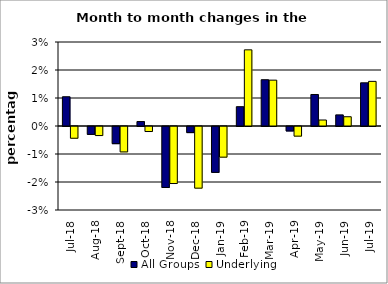
| Category | All Groups | Underlying |
|---|---|---|
| 2018-07-01 | 0.01 | -0.004 |
| 2018-08-01 | -0.003 | -0.003 |
| 2018-09-01 | -0.006 | -0.009 |
| 2018-10-01 | 0.002 | -0.002 |
| 2018-11-01 | -0.022 | -0.02 |
| 2018-12-01 | -0.002 | -0.022 |
| 2019-01-01 | -0.016 | -0.011 |
| 2019-02-01 | 0.007 | 0.027 |
| 2019-03-01 | 0.017 | 0.016 |
| 2019-04-01 | -0.002 | -0.003 |
| 2019-05-01 | 0.011 | 0.002 |
| 2019-06-01 | 0.004 | 0.003 |
| 2019-07-01 | 0.015 | 0.016 |